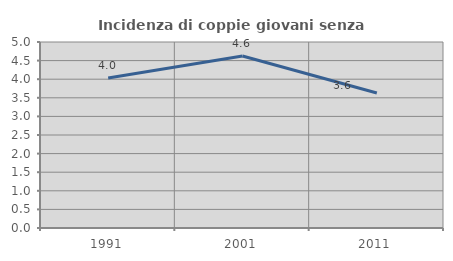
| Category | Incidenza di coppie giovani senza figli |
|---|---|
| 1991.0 | 4.035 |
| 2001.0 | 4.623 |
| 2011.0 | 3.63 |